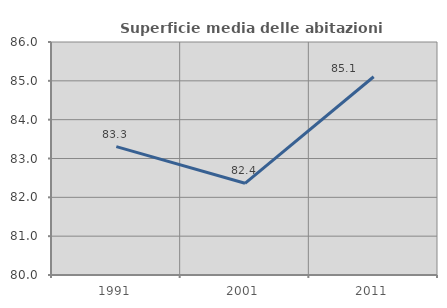
| Category | Superficie media delle abitazioni occupate |
|---|---|
| 1991.0 | 83.304 |
| 2001.0 | 82.361 |
| 2011.0 | 85.105 |